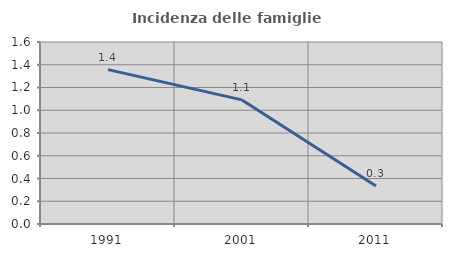
| Category | Incidenza delle famiglie numerose |
|---|---|
| 1991.0 | 1.357 |
| 2001.0 | 1.091 |
| 2011.0 | 0.334 |